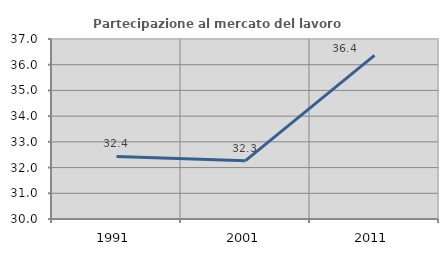
| Category | Partecipazione al mercato del lavoro  femminile |
|---|---|
| 1991.0 | 32.431 |
| 2001.0 | 32.268 |
| 2011.0 | 36.363 |